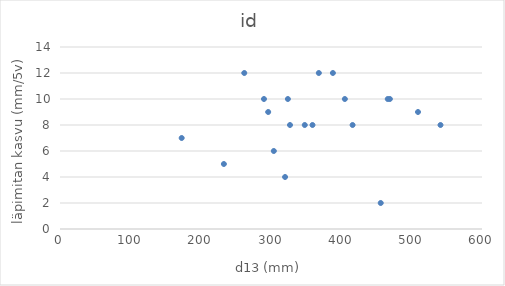
| Category | id |
|---|---|
| 173.0 | 7 |
| 233.0 | 5 |
| 262.0 | 12 |
| 290.0 | 10 |
| 296.0 | 9 |
| 304.0 | 6 |
| 320.0 | 4 |
| 324.0 | 10 |
| 327.0 | 8 |
| 348.0 | 8 |
| 359.0 | 8 |
| 368.0 | 12 |
| 388.0 | 12 |
| 405.0 | 10 |
| 416.0 | 8 |
| 456.0 | 2 |
| 466.0 | 10 |
| 469.0 | 10 |
| 509.0 | 9 |
| 541.0 | 8 |